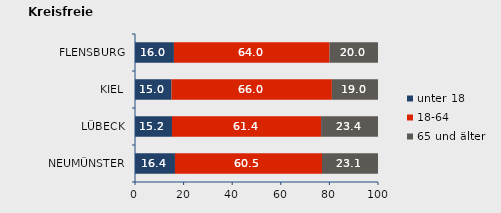
| Category | unter 18 | 18-64 | 65 und älter |
|---|---|---|---|
| NEUMÜNSTER | 16.45 | 60.499 | 23.051 |
| LÜBECK | 15.219 | 61.36 | 23.421 |
| KIEL | 15.025 | 65.995 | 18.98 |
| FLENSBURG | 16.025 | 64.023 | 19.952 |